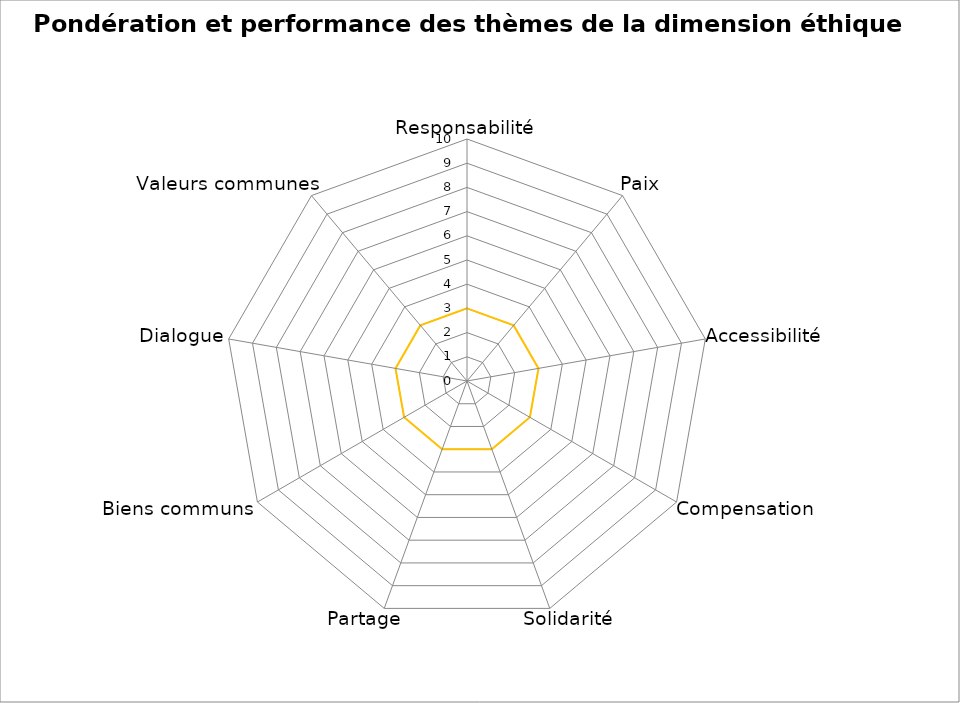
| Category | Performance | Pondération | Series 2 |
|---|---|---|---|
| Responsabilité | 0 | 0 | 3 |
| Paix | 0 | 0 | 3 |
| Accessibilité | 0 | 0 | 3 |
| Compensation | 0 | 0 | 3 |
| Solidarité | 0 | 0 | 3 |
| Partage | 0 | 0 | 3 |
| Biens communs | 0 | 0 | 3 |
| Dialogue | 0 | 0 | 3 |
| Valeurs communes | 0 | 0 | 3 |